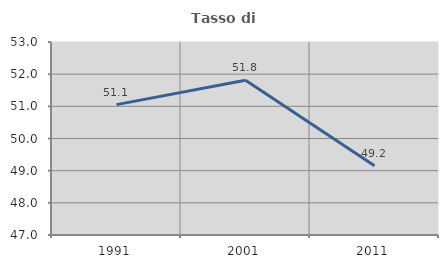
| Category | Tasso di occupazione   |
|---|---|
| 1991.0 | 51.054 |
| 2001.0 | 51.809 |
| 2011.0 | 49.156 |